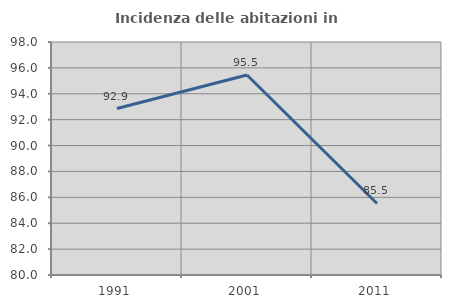
| Category | Incidenza delle abitazioni in proprietà  |
|---|---|
| 1991.0 | 92.857 |
| 2001.0 | 95.455 |
| 2011.0 | 85.526 |